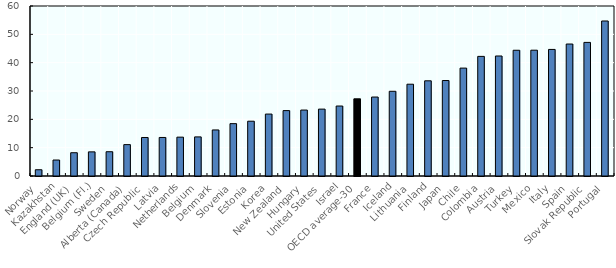
| Category | Principals who "agreed" or "strongly agreed" that the lack of a relevant offer presents a barrier to their participation in professional development |
|---|---|
| Norway | 2.208 |
| Kazakhstan | 5.64 |
| England (UK) | 8.214 |
| Belgium (Fl.) | 8.515 |
| Sweden | 8.567 |
| Alberta (Canada) | 11.076 |
| Czech Republic | 13.59 |
| Latvia | 13.6 |
| Netherlands | 13.71 |
| Belgium | 13.802 |
| Denmark | 16.257 |
| Slovenia | 18.479 |
| Estonia | 19.34 |
| Korea | 21.855 |
| New Zealand | 23.079 |
| Hungary | 23.272 |
| United States | 23.608 |
| Israel | 24.695 |
| OECD average-30 | 27.245 |
| France | 27.867 |
| Iceland | 29.897 |
| Lithuania | 32.396 |
| Finland | 33.599 |
| Japan | 33.695 |
| Chile | 38.084 |
| Colombia | 42.22 |
| Austria | 42.357 |
| Turkey | 44.382 |
| Mexico | 44.402 |
| Italy | 44.67 |
| Spain | 46.582 |
| Slovak Republic | 47.154 |
| Portugal | 54.707 |